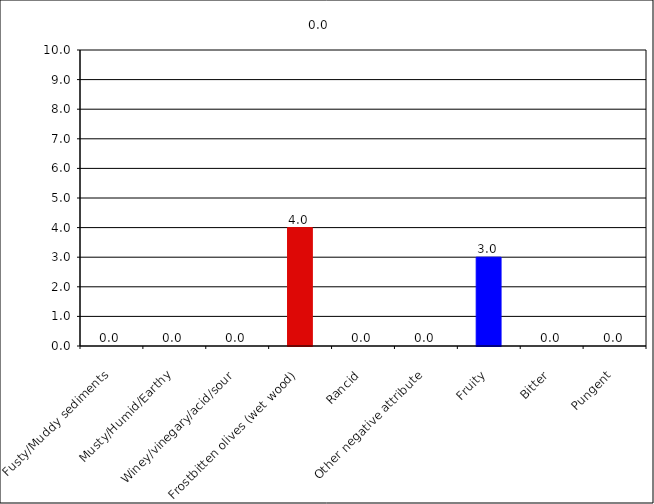
| Category | 0.0 |
|---|---|
| Fusty/Muddy sediments | 0 |
| Musty/Humid/Earthy | 0 |
| Winey/vinegary/acid/sour | 0 |
| Frostbitten olives (wet wood) | 4 |
| Rancid | 0 |
| Other negative attribute | 0 |
| Fruity | 3 |
| Bitter | 0 |
| Pungent | 0 |